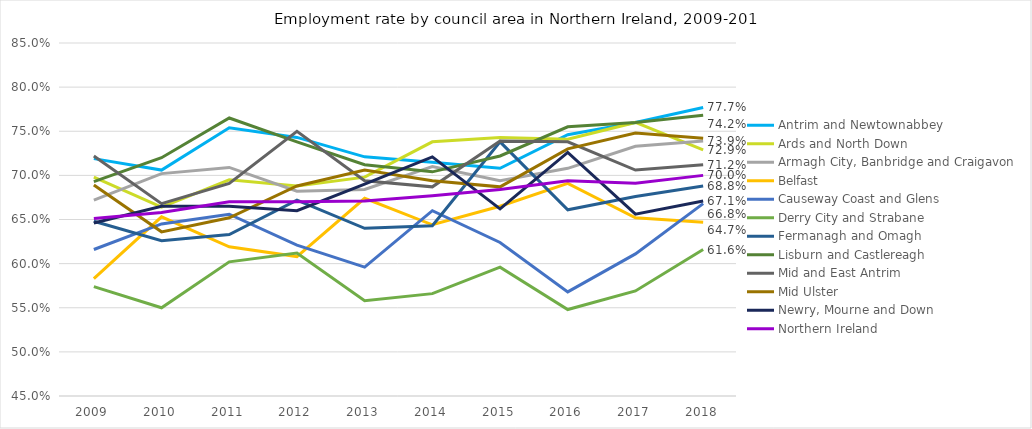
| Category | Antrim and Newtownabbey | Ards and North Down | Armagh City, Banbridge and Craigavon | Belfast | Causeway Coast and Glens | Derry City and Strabane | Fermanagh and Omagh | Lisburn and Castlereagh | Mid and East Antrim | Mid Ulster | Newry, Mourne and Down | Northern Ireland |
|---|---|---|---|---|---|---|---|---|---|---|---|---|
| 2009 | 0.719 | 0.698 | 0.672 | 0.583 | 0.616 | 0.574 | 0.648 | 0.693 | 0.722 | 0.689 | 0.646 | 0.651 |
| 2010 | 0.706 | 0.664 | 0.702 | 0.653 | 0.645 | 0.55 | 0.626 | 0.72 | 0.668 | 0.636 | 0.665 | 0.658 |
| 2011 | 0.754 | 0.695 | 0.709 | 0.619 | 0.656 | 0.602 | 0.633 | 0.765 | 0.691 | 0.652 | 0.665 | 0.67 |
| 2012 | 0.743 | 0.688 | 0.682 | 0.608 | 0.621 | 0.612 | 0.672 | 0.738 | 0.75 | 0.688 | 0.66 | 0.67 |
| 2013 | 0.721 | 0.698 | 0.684 | 0.674 | 0.596 | 0.558 | 0.64 | 0.712 | 0.694 | 0.706 | 0.69 | 0.671 |
| 2014 | 0.715 | 0.738 | 0.71 | 0.644 | 0.66 | 0.566 | 0.643 | 0.704 | 0.687 | 0.694 | 0.721 | 0.677 |
| 2015 | 0.708 | 0.743 | 0.694 | 0.665 | 0.624 | 0.596 | 0.738 | 0.722 | 0.739 | 0.687 | 0.662 | 0.684 |
| 2016 | 0.746 | 0.741 | 0.708 | 0.691 | 0.568 | 0.548 | 0.661 | 0.755 | 0.738 | 0.73 | 0.726 | 0.694 |
| 2017 | 0.76 | 0.76 | 0.733 | 0.652 | 0.611 | 0.569 | 0.676 | 0.76 | 0.706 | 0.748 | 0.656 | 0.691 |
| 2018 | 0.777 | 0.729 | 0.739 | 0.647 | 0.668 | 0.616 | 0.688 | 0.768 | 0.712 | 0.742 | 0.671 | 0.7 |